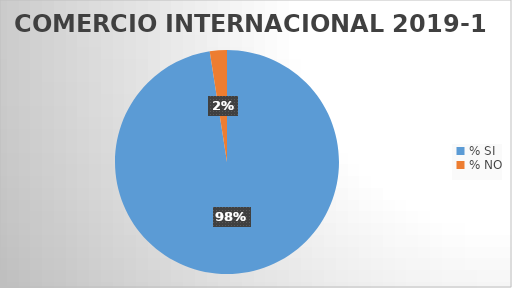
| Category | Series 0 |
|---|---|
| % SI | 97.531 |
| % NO | 2.469 |